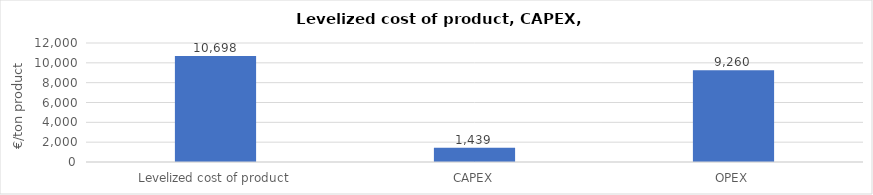
| Category | Series 0 |
|---|---|
| 0 | 10698.32 |
| 1 | 1438.592 |
| 2 | 9259.728 |